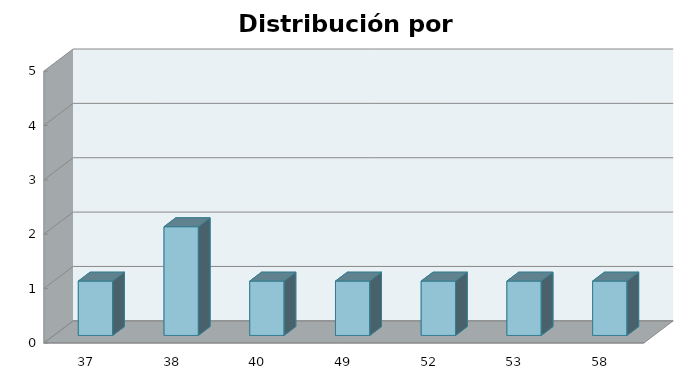
| Category | Series 1 |
|---|---|
| 37.0 | 1 |
| 38.0 | 2 |
| 40.0 | 1 |
| 49.0 | 1 |
| 52.0 | 1 |
| 53.0 | 1 |
| 58.0 | 1 |